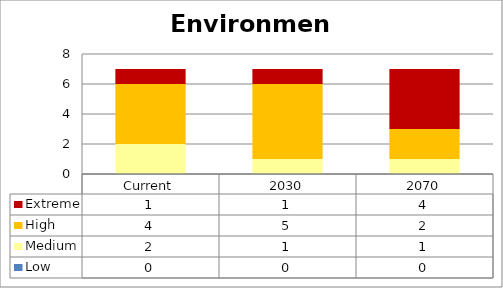
| Category | Low | Medium | High | Extreme |
|---|---|---|---|---|
| Current | 0 | 2 | 4 | 1 |
| 2030 | 0 | 1 | 5 | 1 |
| 2070 | 0 | 1 | 2 | 4 |